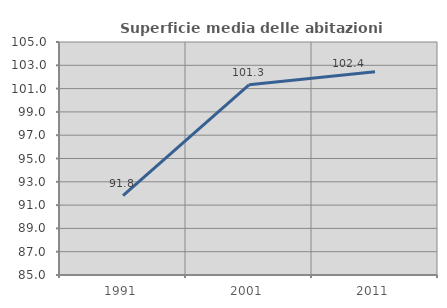
| Category | Superficie media delle abitazioni occupate |
|---|---|
| 1991.0 | 91.804 |
| 2001.0 | 101.321 |
| 2011.0 | 102.444 |